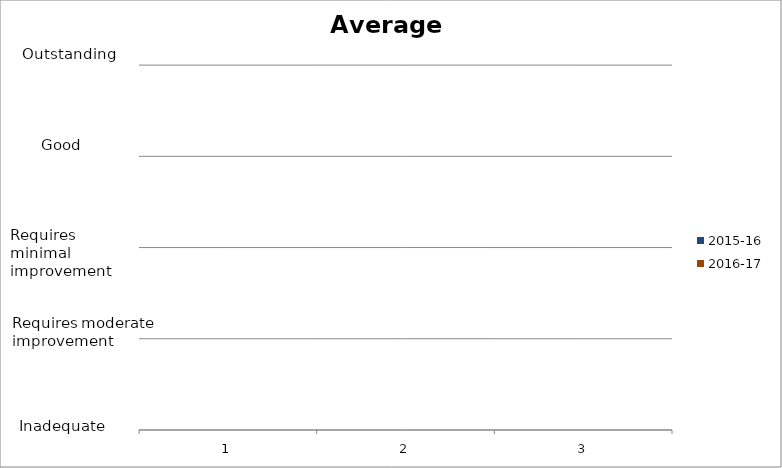
| Category | 2015-16 | 2016-17 |
|---|---|---|
| 0 | 0 | 0 |
| 1 | 0 | 0 |
| 2 | 0 | 0 |